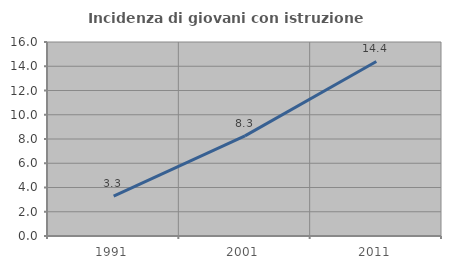
| Category | Incidenza di giovani con istruzione universitaria |
|---|---|
| 1991.0 | 3.284 |
| 2001.0 | 8.257 |
| 2011.0 | 14.397 |